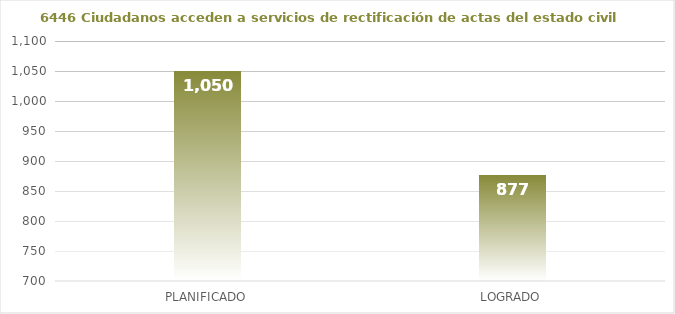
| Category | 6446 |
|---|---|
| PLANIFICADO | 1050 |
| LOGRADO | 877 |